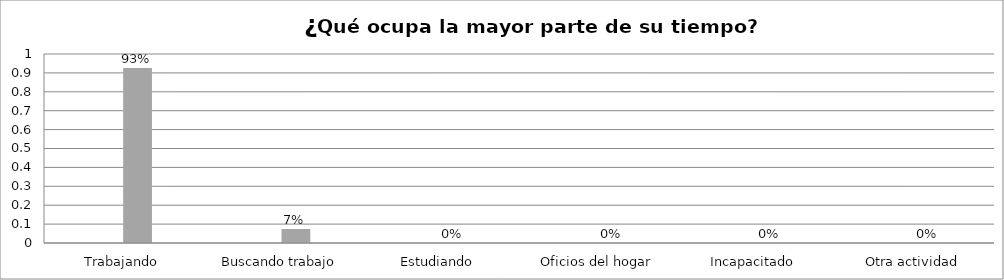
| Category | Series 0 | Series 1 | Series 2 | Series 3 |
|---|---|---|---|---|
| Trabajando |  |  | 0.926 |  |
| Buscando trabajo |  |  | 0.074 |  |
| Estudiando |  |  | 0 |  |
| Oficios del hogar |  |  | 0 |  |
| Incapacitado  |  |  | 0 |  |
| Otra actividad |  |  | 0 |  |